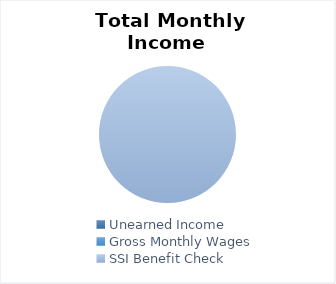
| Category | Total Monthly Income (Before Taxes) |
|---|---|
| 0 | 0 |
| 1 | 0 |
| 2 | 771 |